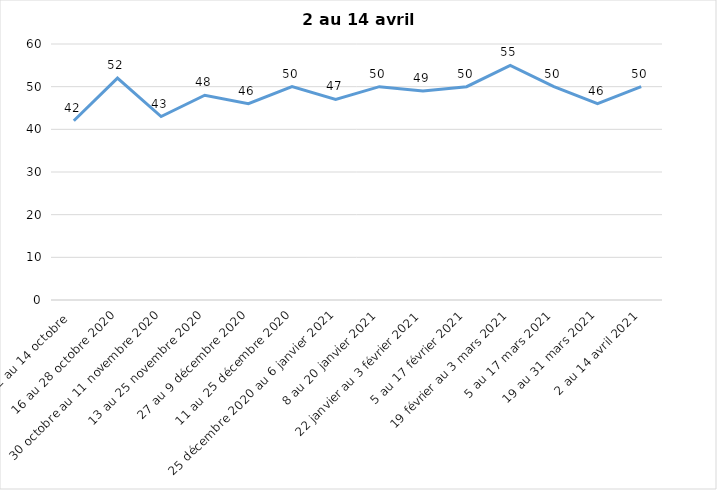
| Category | Toujours aux trois mesures |
|---|---|
| 2 au 14 octobre  | 42 |
| 16 au 28 octobre 2020 | 52 |
| 30 octobre au 11 novembre 2020 | 43 |
| 13 au 25 novembre 2020 | 48 |
| 27 au 9 décembre 2020 | 46 |
| 11 au 25 décembre 2020 | 50 |
| 25 décembre 2020 au 6 janvier 2021 | 47 |
| 8 au 20 janvier 2021 | 50 |
| 22 janvier au 3 février 2021 | 49 |
| 5 au 17 février 2021 | 50 |
| 19 février au 3 mars 2021 | 55 |
| 5 au 17 mars 2021 | 50 |
| 19 au 31 mars 2021 | 46 |
| 2 au 14 avril 2021 | 50 |